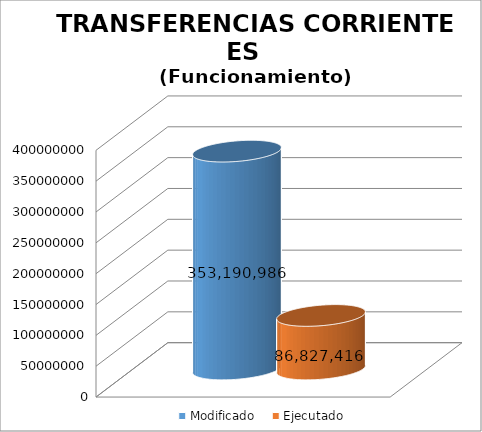
| Category | Modificado | Ejecutado |
|---|---|---|
| 0 | 353190986 | 86827416.2 |